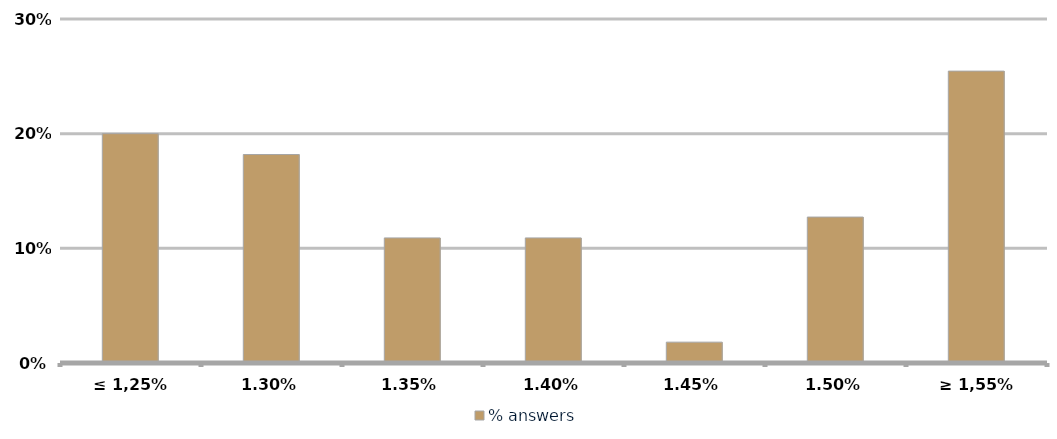
| Category | % answers |
|---|---|
| ≤ 1,25% | 0.2 |
| 1,30% | 0.182 |
| 1,35% | 0.109 |
| 1,40% | 0.109 |
| 1,45% | 0.018 |
| 1,50% | 0.127 |
| ≥ 1,55% | 0.255 |